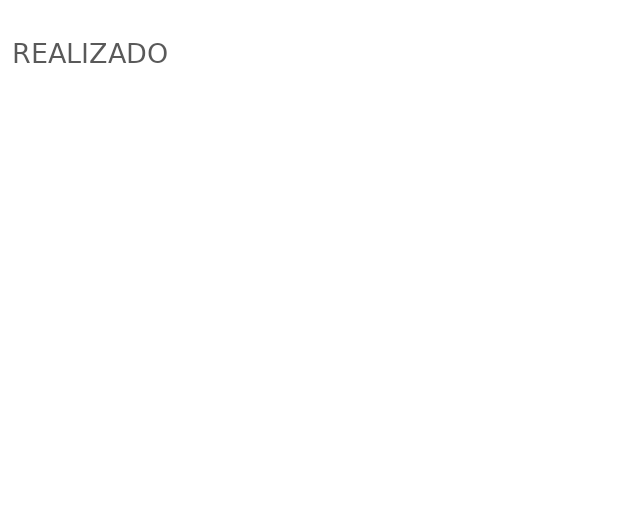
| Category | REALIZADO |
|---|---|
| TRABALHISTA – PERMANENTE | 0 |
| TRABALHISTA – CASUAL | 0 |
| GERAL/ADMIN | 0 |
| OPERAÇÕES | 0 |
| MARKETING/PROMOCIONAIS | 0 |
| SITE/APLICATIVO MÓVEL | 0 |
| PROPRIEDADE | 0 |
| AUTOMÓVEL | 0 |
| CUSTOS | 0 |